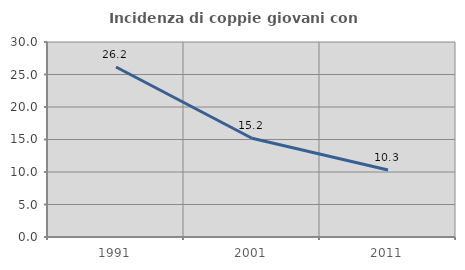
| Category | Incidenza di coppie giovani con figli |
|---|---|
| 1991.0 | 26.154 |
| 2001.0 | 15.19 |
| 2011.0 | 10.309 |